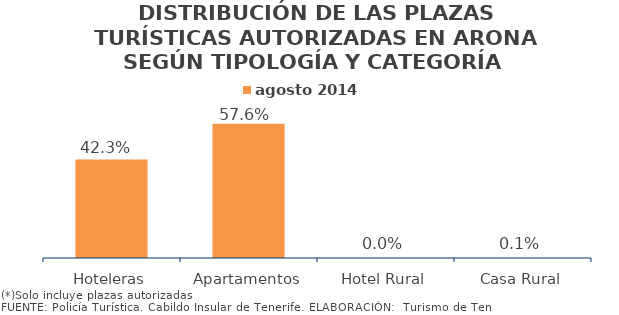
| Category | agosto 2014 |
|---|---|
| Hoteleras | 0.423 |
| Apartamentos | 0.576 |
| Hotel Rural | 0 |
| Casa Rural | 0.001 |